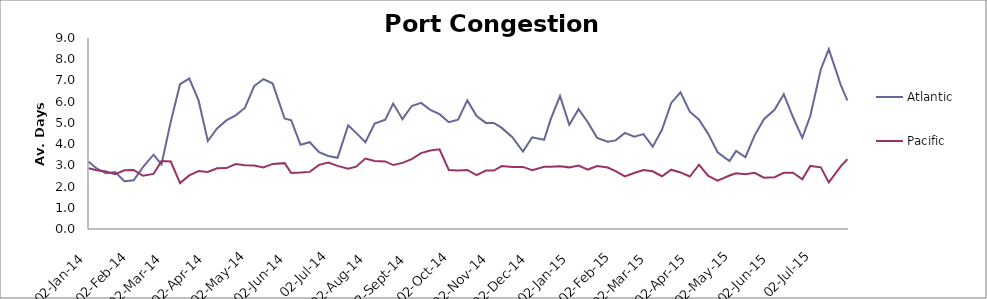
| Category | Atlantic  | Pacific |
|---|---|---|
| 2014-01-02 | 3.167 | 2.863 |
| 2014-01-08 | 2.854 | 2.767 |
| 2014-01-15 | 2.625 | 2.712 |
| 2014-01-22 | 2.688 | 2.582 |
| 2014-01-29 | 2.25 | 2.767 |
| 2014-02-05 | 2.292 | 2.781 |
| 2014-02-12 | 2.917 | 2.507 |
| 2014-02-20 | 3.5 | 2.596 |
| 2014-02-26 | 3.042 | 3.199 |
| 2014-03-05 | 5.059 | 3.178 |
| 2014-03-12 | 6.824 | 2.164 |
| 2014-03-19 | 7.088 | 2.527 |
| 2014-03-26 | 6.059 | 2.733 |
| 2014-04-02 | 4.147 | 2.692 |
| 2014-04-09 | 4.735 | 2.863 |
| 2014-04-16 | 5.118 | 2.87 |
| 2014-04-23 | 5.353 | 3.062 |
| 2014-04-30 | 5.706 | 3 |
| 2014-05-07 | 6.735 | 2.993 |
| 2014-05-14 | 7.059 | 2.904 |
| 2014-05-21 | 6.853 | 3.068 |
| 2014-05-30 | 5.206 | 3.103 |
| 2014-06-04 | 5.118 | 2.637 |
| 2014-06-11 | 3.971 | 2.658 |
| 2014-06-18 | 4.088 | 2.692 |
| 2014-06-25 | 3.618 | 3.021 |
| 2014-07-02 | 3.441 | 3.13 |
| 2014-07-09 | 3.353 | 2.973 |
| 2014-07-17 | 4.882 | 2.836 |
| 2014-07-23 | 4.529 | 2.938 |
| 2014-07-30 | 4.088 | 3.322 |
| 2014-08-06 | 4.971 | 3.205 |
| 2014-08-14 | 5.147 | 3.185 |
| 2014-08-20 | 5.912 | 3.014 |
| 2014-08-27 | 5.176 | 3.116 |
| 2014-09-03 | 5.794 | 3.295 |
| 2014-09-10 | 5.941 | 3.575 |
| 2014-09-17 | 5.618 | 3.699 |
| 2014-09-24 | 5.412 | 3.753 |
| 2014-10-01 | 5.029 | 2.781 |
| 2014-10-08 | 5.147 | 2.753 |
| 2014-10-15 | 6.059 | 2.785 |
| 2014-10-22 | 5.324 | 2.541 |
| 2014-10-29 | 5 | 2.753 |
| 2014-11-04 | 5 | 2.753 |
| 2014-11-10 | 4.765 | 2.966 |
| 2014-11-18 | 4.324 | 2.918 |
| 2014-11-26 | 3.647 | 2.925 |
| 2014-12-03 | 4.324 | 2.767 |
| 2014-12-12 | 4.206 | 2.932 |
| 2014-12-17 | 5.176 | 2.938 |
| 2014-12-24 | 6.265 | 2.952 |
| 2014-12-31 | 4.912 | 2.904 |
| 2015-01-07 | 5.647 | 2.993 |
| 2015-01-14 | 5.029 | 2.801 |
| 2015-01-21 | 4.294 | 2.966 |
| 2015-01-29 | 4.118 | 2.897 |
| 2015-02-04 | 4.176 | 2.726 |
| 2015-02-11 | 4.529 | 2.479 |
| 2015-02-18 | 4.353 | 2.637 |
| 2015-02-25 | 4.471 | 2.774 |
| 2015-03-04 | 3.882 | 2.719 |
| 2015-03-11 | 4.676 | 2.486 |
| 2015-03-18 | 5.941 | 2.795 |
| 2015-03-25 | 6.441 | 2.664 |
| 2015-04-01 | 5.529 | 2.473 |
| 2015-04-08 | 5.147 | 3.027 |
| 2015-04-15 | 4.471 | 2.5 |
| 2015-04-22 | 3.618 | 2.274 |
| 2015-05-01 | 3.206 | 2.521 |
| 2015-05-06 | 3.676 | 2.63 |
| 2015-05-13 | 3.382 | 2.575 |
| 2015-05-20 | 4.412 | 2.651 |
| 2015-05-27 | 5.176 | 2.418 |
| 2015-06-04 | 5.618 | 2.442 |
| 2015-06-11 | 6.353 | 2.645 |
| 2015-06-18 | 5.265 | 2.651 |
| 2015-06-25 | 4.294 | 2.342 |
| 2015-07-01 | 5.324 | 2.973 |
| 2015-07-09 | 7.529 | 2.904 |
| 2015-07-15 | 8.471 | 2.196 |
| 2015-07-24 | 6.794 | 2.952 |
| 2015-07-29 | 6.059 | 3.288 |